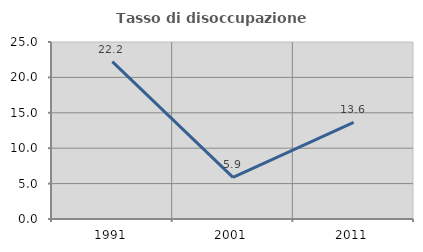
| Category | Tasso di disoccupazione giovanile  |
|---|---|
| 1991.0 | 22.222 |
| 2001.0 | 5.882 |
| 2011.0 | 13.636 |